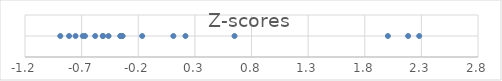
| Category | Series 0 |
|---|---|
| -0.8883503126156952 | 1 |
| -0.8108541880073471 | 1 |
| -0.753751780401196 | 1 |
| -0.6895115718442758 | 1 |
| -0.6701375406921888 | 1 |
| -0.5804051858825227 | 1 |
| -0.513105919775273 | 1 |
| -0.5110665480750534 | 1 |
| -0.46212162726978084 | 1 |
| -0.35811367055857685 | 1 |
| -0.35709398470846704 | 1 |
| -0.34791681205747843 | 1 |
| -0.33771995355638 | 1 |
| -0.16539304488781656 | 1 |
| 0.10992213464184102 | 1 |
| 0.21698914890337453 | 1 |
| 0.6503556352000578 | 1 |
| 2.0044984441459293 | 1 |
| 2.182943467915152 | 1 |
| 2.280833309525697 | 1 |